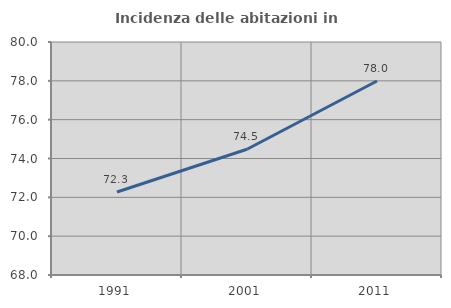
| Category | Incidenza delle abitazioni in proprietà  |
|---|---|
| 1991.0 | 72.273 |
| 2001.0 | 74.477 |
| 2011.0 | 77.989 |